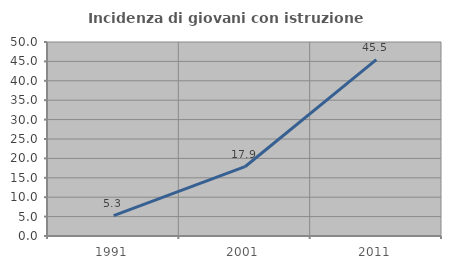
| Category | Incidenza di giovani con istruzione universitaria |
|---|---|
| 1991.0 | 5.263 |
| 2001.0 | 17.857 |
| 2011.0 | 45.455 |